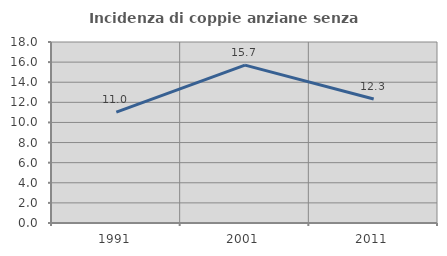
| Category | Incidenza di coppie anziane senza figli  |
|---|---|
| 1991.0 | 11.032 |
| 2001.0 | 15.7 |
| 2011.0 | 12.325 |